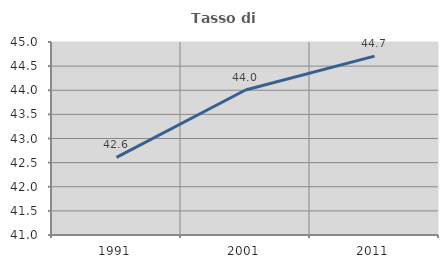
| Category | Tasso di occupazione   |
|---|---|
| 1991.0 | 42.61 |
| 2001.0 | 44.006 |
| 2011.0 | 44.708 |